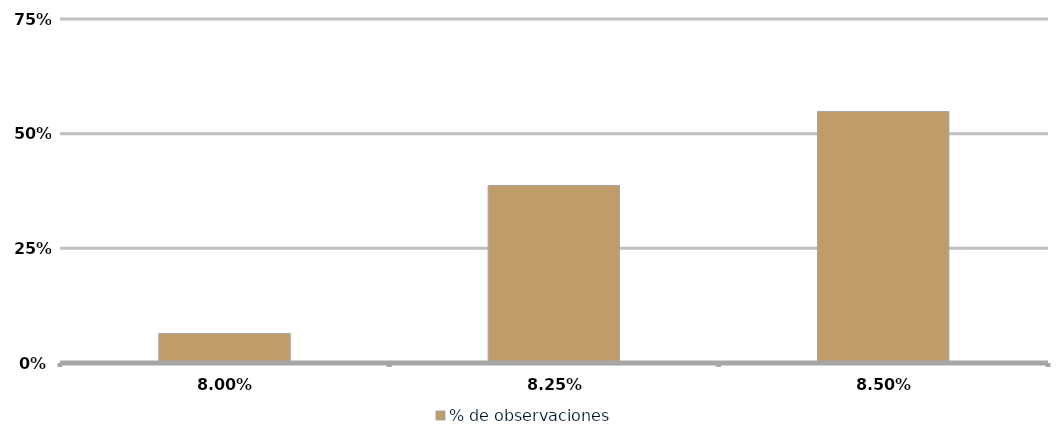
| Category | % de observaciones  |
|---|---|
| 0.08 | 0.065 |
| 0.0825 | 0.387 |
| 0.085 | 0.548 |